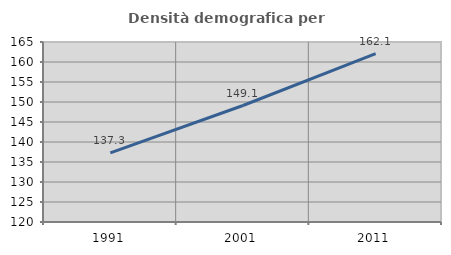
| Category | Densità demografica |
|---|---|
| 1991.0 | 137.271 |
| 2001.0 | 149.124 |
| 2011.0 | 162.081 |